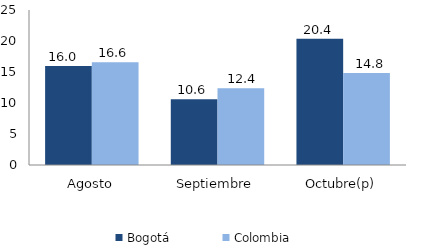
| Category | Bogotá | Colombia |
|---|---|---|
| Agosto | 15.973 | 16.582 |
| Septiembre | 10.613 | 12.381 |
| Octubre(p) | 20.353 | 14.823 |